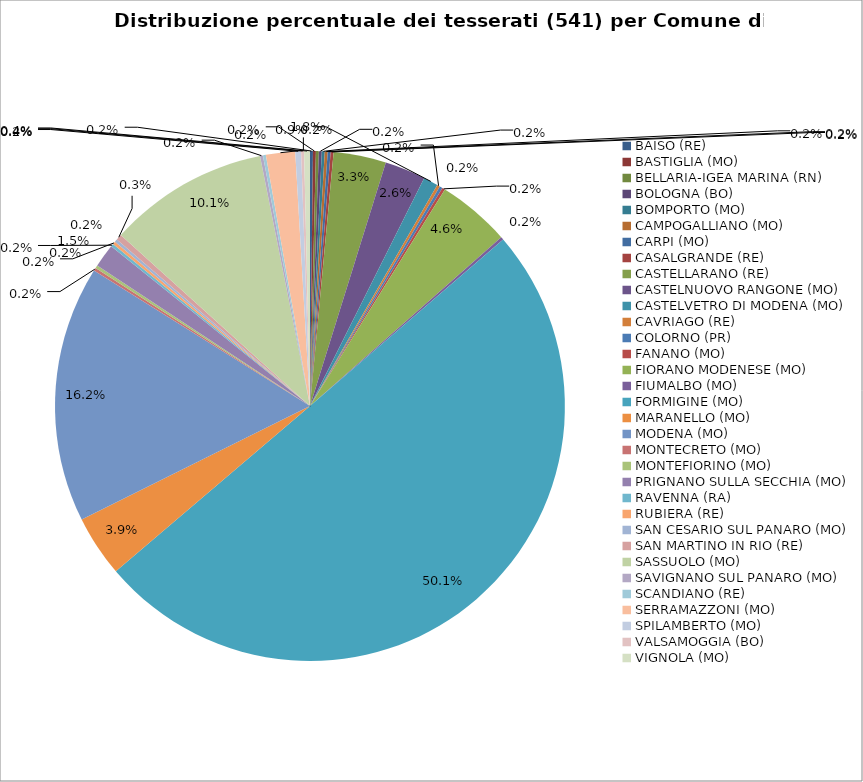
| Category | Nr. Tesserati |
|---|---|
| BAISO (RE) | 1 |
| BASTIGLIA (MO) | 1 |
| BELLARIA-IGEA MARINA (RN) | 1 |
| BOLOGNA (BO) | 1 |
| BOMPORTO (MO) | 1 |
| CAMPOGALLIANO (MO) | 1 |
| CARPI (MO) | 1 |
| CASALGRANDE (RE) | 1 |
| CASTELLARANO (RE) | 18 |
| CASTELNUOVO RANGONE (MO) | 14 |
| CASTELVETRO DI MODENA (MO) | 5 |
| CAVRIAGO (RE) | 1 |
| COLORNO (PR) | 1 |
| FANANO (MO) | 1 |
| FIORANO MODENESE (MO) | 25 |
| FIUMALBO (MO) | 1 |
| FORMIGINE (MO) | 271 |
| MARANELLO (MO) | 21 |
| MODENA (MO) | 88 |
| MONTECRETO (MO) | 1 |
| MONTEFIORINO (MO) | 1 |
| PRIGNANO SULLA SECCHIA (MO) | 8 |
| RAVENNA (RA) | 1 |
| RUBIERA (RE) | 1 |
| SAN CESARIO SUL PANARO (MO) | 1 |
| SAN MARTINO IN RIO (RE) | 2 |
| SASSUOLO (MO) | 55 |
| SAVIGNANO SUL PANARO (MO) | 1 |
| SCANDIANO (RE) | 1 |
| SERRAMAZZONI (MO) | 10 |
| SPILAMBERTO (MO) | 2 |
| VALSAMOGGIA (BO) | 1 |
| VIGNOLA (MO) | 2 |